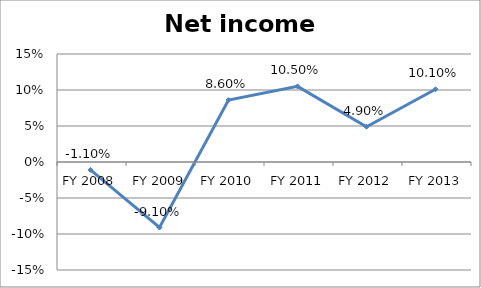
| Category | Net income ratio |
|---|---|
| FY 2013 | 0.101 |
| FY 2012 | 0.049 |
| FY 2011 | 0.105 |
| FY 2010 | 0.086 |
| FY 2009 | -0.091 |
| FY 2008 | -0.011 |